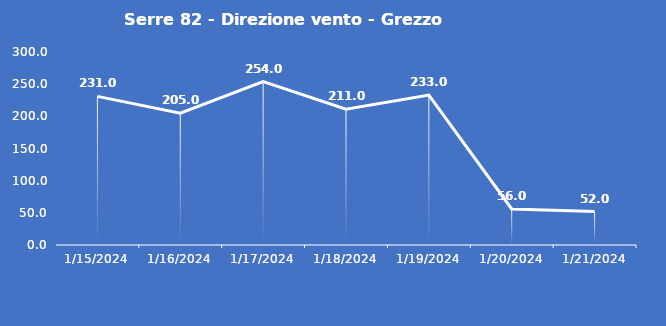
| Category | Serre 82 - Direzione vento - Grezzo (°N) |
|---|---|
| 1/15/24 | 231 |
| 1/16/24 | 205 |
| 1/17/24 | 254 |
| 1/18/24 | 211 |
| 1/19/24 | 233 |
| 1/20/24 | 56 |
| 1/21/24 | 52 |